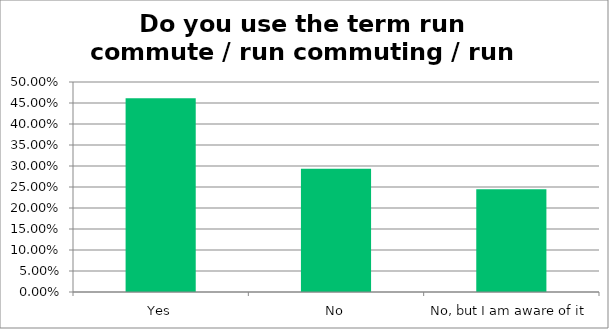
| Category | Responses |
|---|---|
| Yes | 0.462 |
| No | 0.294 |
| No, but I am aware of it | 0.245 |